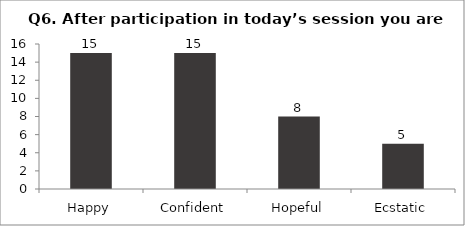
| Category | Q6. After participation in today’s session you are feeling? |
|---|---|
| Happy | 15 |
| Confident | 15 |
| Hopeful | 8 |
| Ecstatic | 5 |